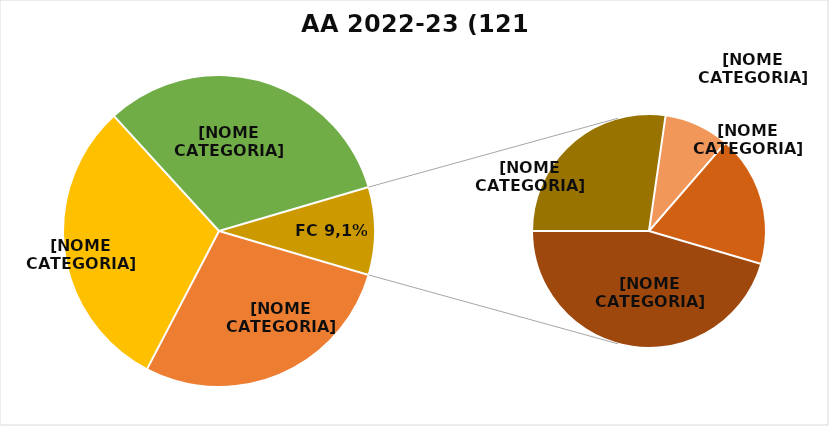
| Category | Series 0 |
|---|---|
| PRIMO ANNO | 34 |
| SECONDO ANNO | 37 |
| TERZO ANNO IC | 39 |
| FC 1 ANNO | 5 |
| FC 2 ANNI | 3 |
| FC 3 ANNI | 0 |
| FC 4 ANNI | 1 |
| FC 5 ANNI | 0 |
| FC 6 ANNI | 0 |
| FC 7 ANNI | 2 |